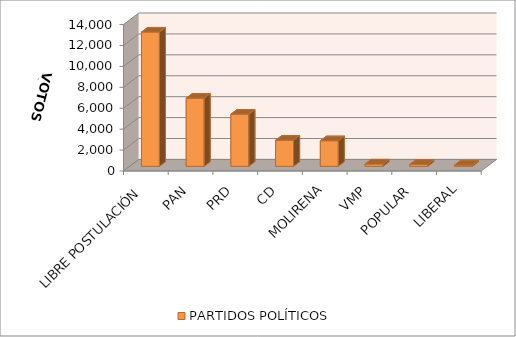
| Category | PARTIDOS POLÍTICOS |
|---|---|
| LIBRE POSTULACIÓN | 12834 |
| PAN | 6514 |
| PRD | 4989 |
| CD | 2495 |
| MOLIRENA | 2443 |
| VMP | 217 |
| POPULAR | 180 |
| LIBERAL | 115 |